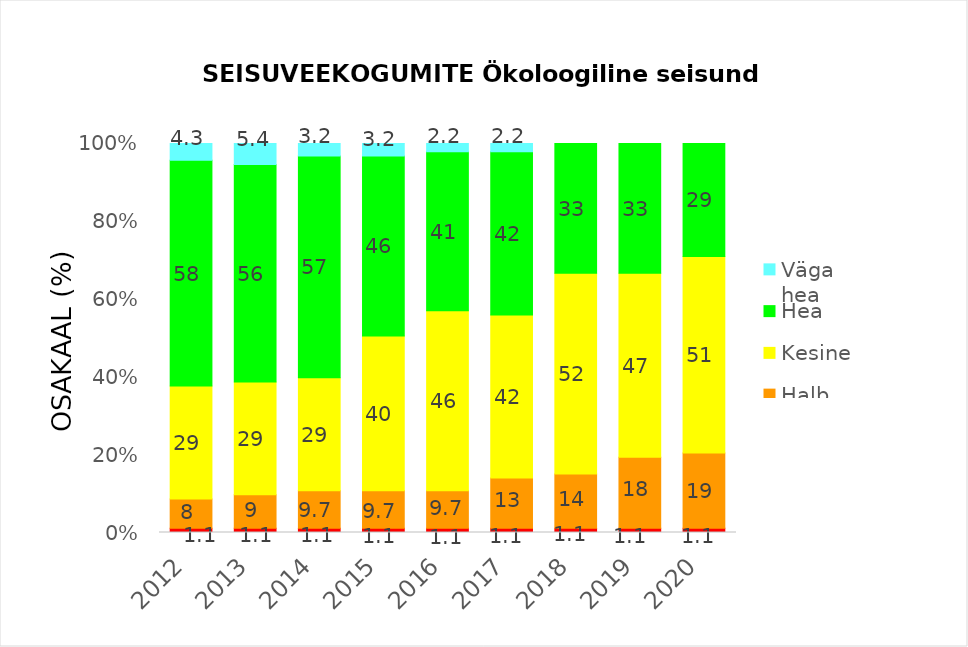
| Category | Väga halb | Halb | Kesine | Hea | Väga hea |
|---|---|---|---|---|---|
| 2012.0 | 1.075 | 7.527 | 29.032 | 58.065 | 4.301 |
| 2013.0 | 1.075 | 8.602 | 29.032 | 55.914 | 5.376 |
| 2014.0 | 1.075 | 9.677 | 29.032 | 56.989 | 3.226 |
| 2015.0 | 1.075 | 9.677 | 39.785 | 46.237 | 3.226 |
| 2016.0 | 1.075 | 9.677 | 46.237 | 40.86 | 2.151 |
| 2017.0 | 1.075 | 12.903 | 41.935 | 41.935 | 2.151 |
| 2018.0 | 1.075 | 13.978 | 51.613 | 33.333 | 0 |
| 2019.0 | 1.075 | 18.28 | 47.312 | 33.333 | 0 |
| 2020.0 | 1.075 | 19.355 | 50.538 | 29.032 | 0 |